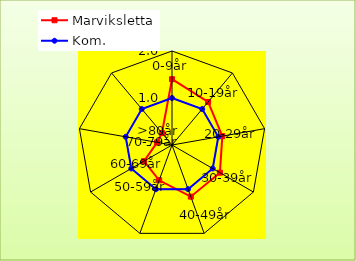
| Category | Marviksletta | Kom. |
|---|---|---|
| 0-9år | 1.4 | 1 |
| 10-19år | 1.195 | 1 |
| 20-29år | 1.087 | 1 |
| 30-39år | 1.177 | 1 |
| 40-49år | 1.17 | 1 |
| 50-59år | 0.798 | 1 |
| 60-69år | 0.687 | 1 |
| 70-79år | 0.321 | 1 |
| >80år | 0.333 | 1 |